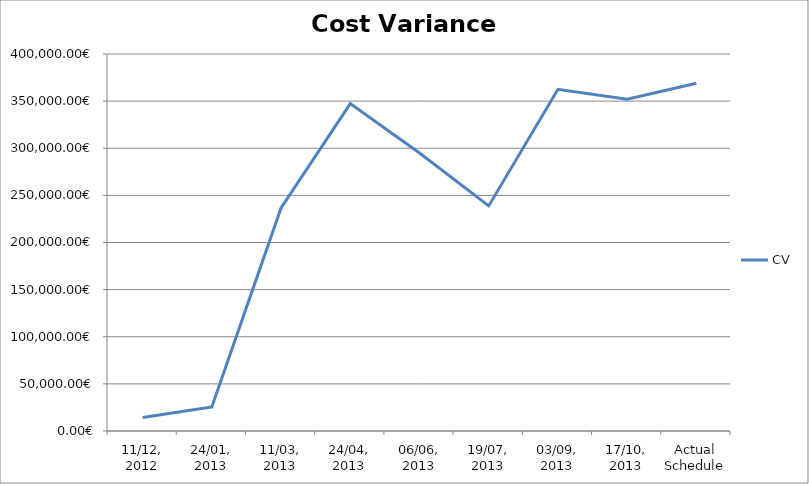
| Category | CV |
|---|---|
| 11/12, 2012 | 14387.454 |
| 24/01, 2013 | 25478.56 |
| 11/03, 2013 | 236559.004 |
| 24/04, 2013 | 347378.492 |
| 06/06, 2013 | 295003.854 |
| 19/07, 2013 | 238823.986 |
| 03/09, 2013 | 362505.096 |
| 17/10, 2013 | 352081.808 |
| Actual Schedule | 369049.256 |